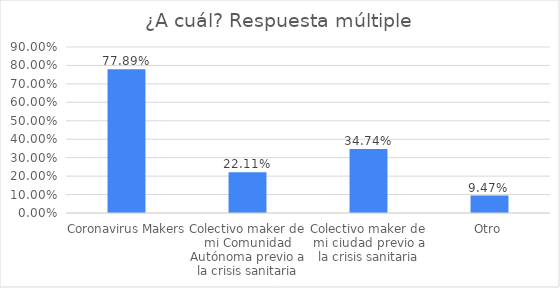
| Category | % |
|---|---|
| Coronavirus Makers | 0.779 |
| Colectivo maker de mi Comunidad Autónoma previo a la crisis sanitaria | 0.221 |
| Colectivo maker de mi ciudad previo a la crisis sanitaria | 0.347 |
| Otro | 0.095 |